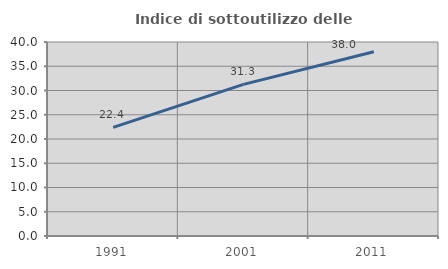
| Category | Indice di sottoutilizzo delle abitazioni  |
|---|---|
| 1991.0 | 22.389 |
| 2001.0 | 31.254 |
| 2011.0 | 37.984 |